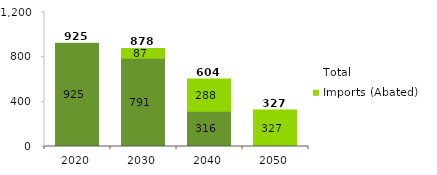
| Category | Imports (Unabated) | Imports (Abated) | Total |
|---|---|---|---|
| 2020.0 | 925.386 | 0 | 925.386 |
| 2030.0 | 791.115 | 86.565 | 877.681 |
| 2040.0 | 316.277 | 287.748 | 604.025 |
| 2050.0 | 0 | 326.801 | 326.801 |